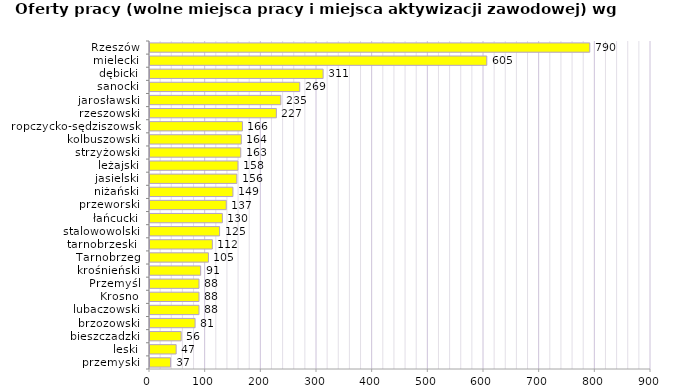
| Category | Oferty pracy (wolne miejsca pracy i miejsca aktywizacji zawodowej) wg powiatów |
|---|---|
| przemyski | 37 |
| leski | 47 |
| bieszczadzki | 56 |
| brzozowski | 81 |
| lubaczowski | 88 |
| Krosno | 88 |
| Przemyśl | 88 |
| krośnieński | 91 |
| Tarnobrzeg | 105 |
| tarnobrzeski  | 112 |
| stalowowolski | 125 |
| łańcucki | 130 |
| przeworski | 137 |
| niżański | 149 |
| jasielski | 156 |
| leżajski | 158 |
| strzyżowski | 163 |
| kolbuszowski | 164 |
| ropczycko-sędziszowski | 166 |
| rzeszowski | 227 |
| jarosławski | 235 |
| sanocki | 269 |
| dębicki | 311 |
| mielecki | 605 |
| Rzeszów | 790 |